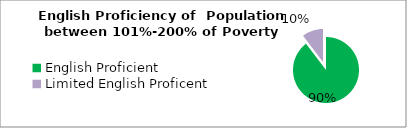
| Category | Percent |
|---|---|
| English Proficient | 0.897 |
| Limited English Proficent | 0.103 |